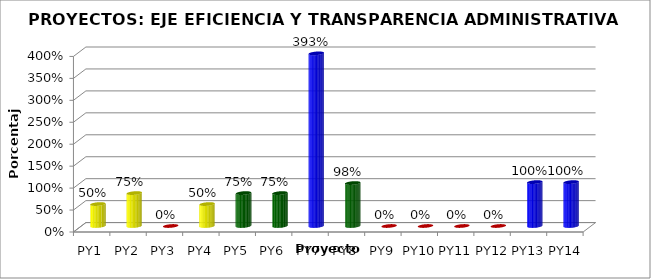
| Category | Series 0 |
|---|---|
| PY1 | 0.5 |
| PY2 | 0.75 |
| PY3 | 0 |
| PY4 | 0.5 |
| PY5 | 0.75 |
| PY6 | 0.75 |
| PY7 | 3.933 |
| PY8 | 0.979 |
| PY9 | 0 |
| PY10 | 0 |
| PY11 | 0 |
| PY12 | 0 |
| PY13 | 1 |
| PY14 | 1 |